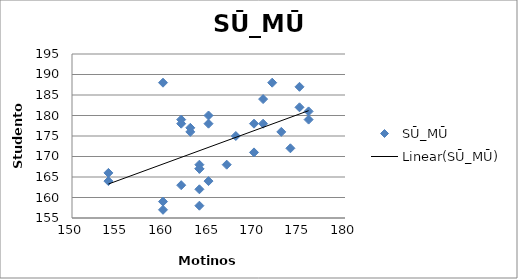
| Category | SŪ_MŪ |
|---|---|
| 165.0 | 164 |
| 154.0 | 166 |
| 171.0 | 178 |
| 174.0 | 172 |
| 173.0 | 176 |
| 170.0 | 178 |
| 175.0 | 182 |
| 164.0 | 162 |
| 171.0 | 184 |
| 162.0 | 179 |
| 172.0 | 188 |
| 165.0 | 178 |
| 168.0 | 175 |
| 176.0 | 179 |
| 162.0 | 163 |
| 160.0 | 188 |
| 175.0 | 187 |
| 154.0 | 164 |
| 170.0 | 171 |
| 160.0 | 159 |
| 160.0 | 157 |
| 165.0 | 180 |
| 164.0 | 158 |
| 164.0 | 168 |
| 162.0 | 178 |
| 163.0 | 177 |
| 176.0 | 181 |
| 164.0 | 167 |
| 167.0 | 168 |
| 163.0 | 176 |
| 164.0 | 167 |